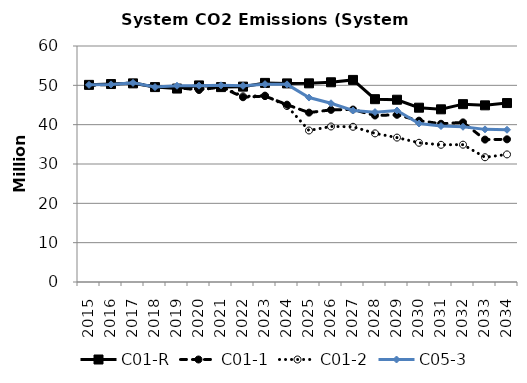
| Category | C01-R | C01-1 | C01-2 | C05-3 |
|---|---|---|---|---|
| 2015.0 | 50.118 | 49.98 | 50.118 | 50.119 |
| 2016.0 | 50.329 | 50.239 | 50.238 | 50.239 |
| 2017.0 | 50.499 | 50.623 | 50.622 | 50.623 |
| 2018.0 | 49.555 | 49.637 | 49.636 | 49.556 |
| 2019.0 | 49.181 | 49.422 | 49.421 | 49.9 |
| 2020.0 | 49.976 | 48.827 | 48.938 | 49.922 |
| 2021.0 | 49.548 | 49.578 | 49.665 | 50.013 |
| 2022.0 | 49.671 | 46.971 | 47.203 | 49.872 |
| 2023.0 | 50.618 | 47.262 | 47.383 | 50.303 |
| 2024.0 | 50.491 | 45.086 | 44.746 | 50.252 |
| 2025.0 | 50.508 | 43.063 | 38.519 | 46.893 |
| 2026.0 | 50.777 | 43.764 | 39.539 | 45.442 |
| 2027.0 | 51.38 | 43.847 | 39.462 | 43.605 |
| 2028.0 | 46.481 | 42.329 | 37.785 | 43.189 |
| 2029.0 | 46.342 | 42.511 | 36.715 | 43.594 |
| 2030.0 | 44.317 | 41.021 | 35.397 | 40.299 |
| 2031.0 | 43.901 | 40.228 | 34.881 | 39.646 |
| 2032.0 | 45.215 | 40.585 | 34.915 | 39.467 |
| 2033.0 | 44.915 | 36.207 | 31.713 | 38.804 |
| 2034.0 | 45.496 | 36.272 | 32.435 | 38.707 |